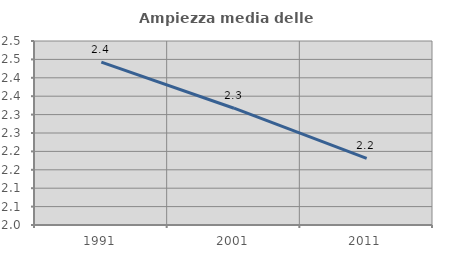
| Category | Ampiezza media delle famiglie |
|---|---|
| 1991.0 | 2.443 |
| 2001.0 | 2.317 |
| 2011.0 | 2.181 |